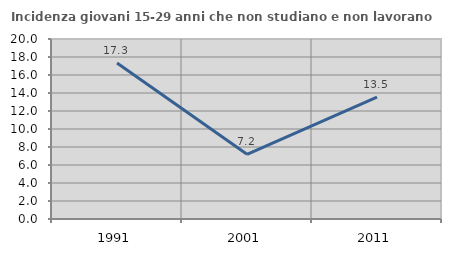
| Category | Incidenza giovani 15-29 anni che non studiano e non lavorano  |
|---|---|
| 1991.0 | 17.333 |
| 2001.0 | 7.187 |
| 2011.0 | 13.537 |